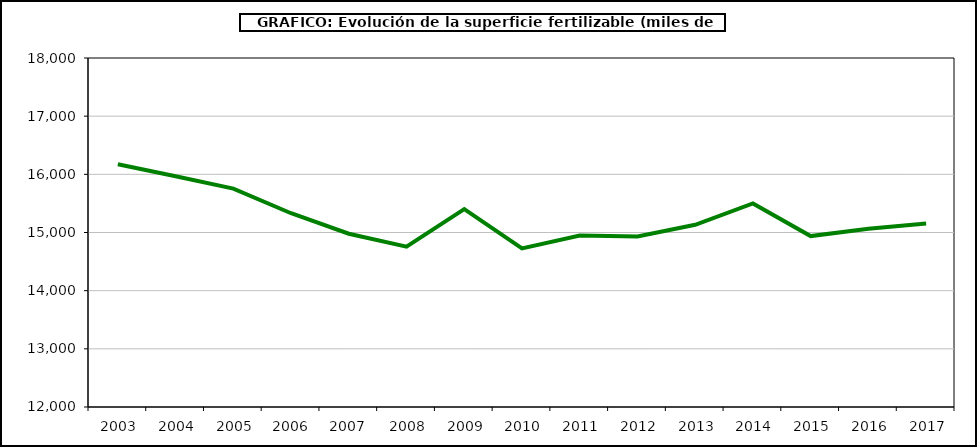
| Category | fertilizantes |
|---|---|
|   2003 | 16174 |
|   2004 | 15965.705 |
|   2005 | 15754.807 |
|   2006  | 15331.413 |
|   2007  | 14979.076 |
|   2008 | 14757 |
|   2009 | 15402 |
|   2010 | 14727 |
|   2011 | 14947 |
|   2012 | 14932 |
|   2013 | 15133 |
|   2014 | 15499 |
|   2015 | 14938 |
|   2016 | 15065 |
|   2017 | 15153 |